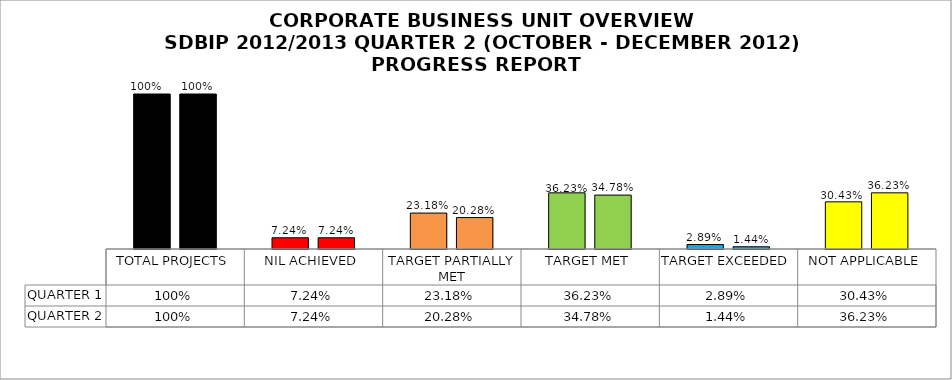
| Category | QUARTER 1 | QUARTER 2 |
|---|---|---|
| TOTAL PROJECTS | 1 | 1 |
| NIL ACHIEVED | 0.072 | 0.072 |
| TARGET PARTIALLY MET | 0.232 | 0.203 |
| TARGET MET | 0.362 | 0.348 |
| TARGET EXCEEDED | 0.029 | 0.014 |
| NOT APPLICABLE | 0.304 | 0.362 |